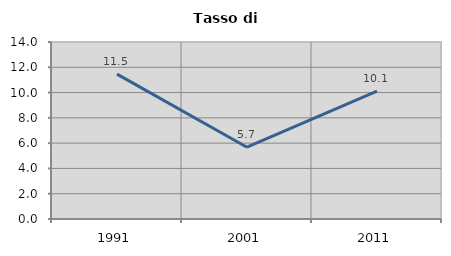
| Category | Tasso di disoccupazione   |
|---|---|
| 1991.0 | 11.461 |
| 2001.0 | 5.675 |
| 2011.0 | 10.106 |